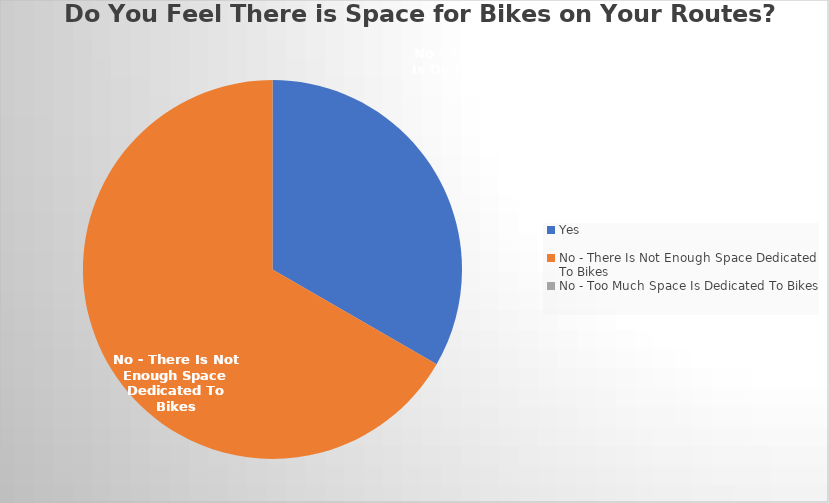
| Category | Series 0 |
|---|---|
| Yes | 21 |
| No - There Is Not Enough Space Dedicated To Bikes | 42 |
| No - Too Much Space Is Dedicated To Bikes  | 0 |